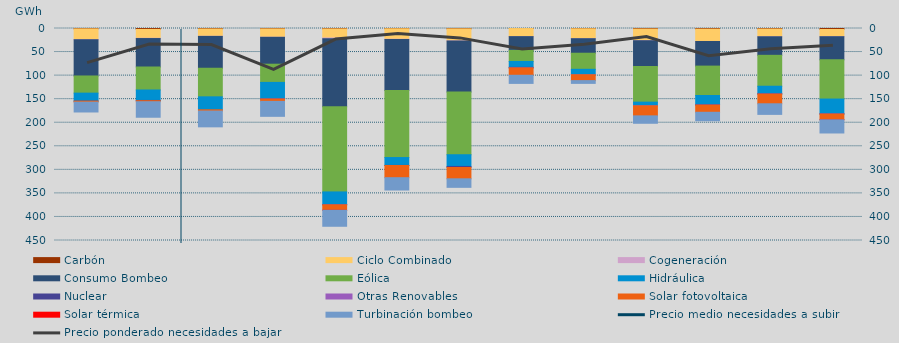
| Category | Carbón | Ciclo Combinado | Cogeneración | Consumo Bombeo | Eólica | Hidráulica | Nuclear | Otras Renovables | Solar fotovoltaica | Solar térmica | Turbinación bombeo |
|---|---|---|---|---|---|---|---|---|---|---|---|
| 0 | 804 | 22741.325 | 259.55 | 76959.4 | 36430.1 | 16893 | 82 | 0 | 2101.325 | 0 | 20947.55 |
| 1 | 1954 | 18792.9 | 569.425 | 60395.65 | 48803.7 | 22168.6 | 540.725 | 0 | 2191.975 | 0 | 32969.35 |
| 2 | 1013 | 15498.975 | 284.05 | 67580.25 | 60658.55 | 27501.4 | 0 | 0 | 2682.825 | 0 | 33526.625 |
| 3 | 883 | 17650.875 | 181.5 | 57086.475 | 38624.325 | 35109.7 | 186 | 16 | 4912.925 | 0 | 31800.3 |
| 4 | 906 | 19278.9 | 1400.95 | 144482.175 | 180813.55 | 26734.575 | 692.75 | 22 | 11477.9 | 11 | 34001.625 |
| 5 | 552 | 22218.15 | 797.8 | 108258.5 | 142089.65 | 16666.15 | 246.5 | 0 | 25852.05 | 0 | 26149.6 |
| 6 | 807.25 | 25335.65 | 347.3 | 108093.3 | 133344.025 | 24879.7 | 2223.5 | 0 | 24040.15 | 0 | 18092.95 |
| 7 | 106 | 17047.925 | 126.5 | 29117.95 | 23568.5 | 12502.85 | 1151.275 | 77.25 | 15574.875 | 0 | 17276.575 |
| 8 | 579.2 | 20963.4 | 137.5 | 30788.55 | 34164.875 | 11525.425 | 0 | 54.75 | 12384.3 | 0 | 5908.5 |
| 9 | 1158 | 24501.45 | 317.675 | 54673.8 | 75655.3 | 7633.3 | 0 | 222.25 | 21301.725 | 0 | 15716.4 |
| 10 | 1320 | 26201.875 | 114.975 | 52169.95 | 62410.575 | 19581.95 | 749.725 | 79.5 | 15213.95 | 0 | 17984.525 |
| 11 | 1091.6 | 16369.1 | 103.875 | 39371.7 | 65624.175 | 15878.2 | 732.15 | 7.75 | 20634.675 | 0 | 22496.1 |
| 12 | 2086.9 | 15113 | 225.75 | 49033.5 | 83287.225 | 31392.5 | 350.375 | 84.5 | 12135.55 | 4 | 28067.275 |